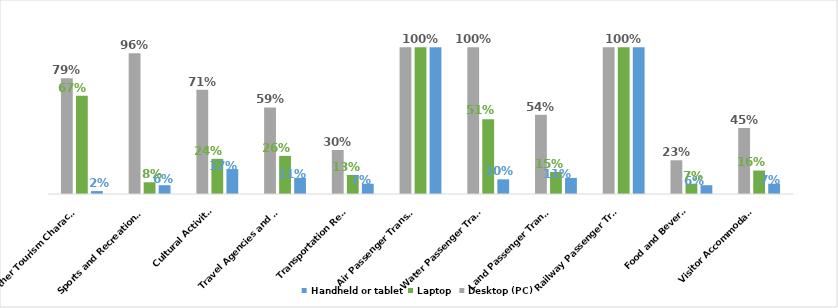
| Category | Handheld or tablet | Laptop | Desktop (PC) |
|---|---|---|---|
|  Visitor Accommodation | 0.07 | 0.16 | 0.45 |
| Food and Beverage | 0.06 | 0.07 | 0.23 |
|  Railway Passenger Transport | 1 | 1 | 1 |
|  Land Passenger Transport | 0.11 | 0.15 | 0.54 |
|  Water Passenger Transport | 0.1 | 0.51 | 1 |
|  Air Passenger Transport | 1 | 1 | 1 |
|  Transportation Rental | 0.07 | 0.13 | 0.3 |
|   Travel Agencies and Reservation Services | 0.11 | 0.26 | 0.59 |
| Cultural Activities | 0.17 | 0.24 | 0.71 |
| Sports and Recreational Activities | 0.06 | 0.08 | 0.96 |
| Other Tourism Characteristic Services  | 0.02 | 0.67 | 0.79 |